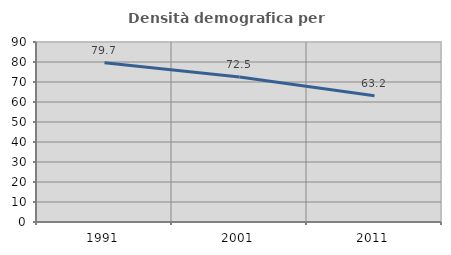
| Category | Densità demografica |
|---|---|
| 1991.0 | 79.67 |
| 2001.0 | 72.502 |
| 2011.0 | 63.156 |